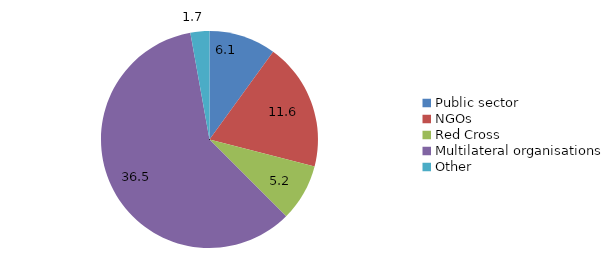
| Category | DAC donors |
|---|---|
| Public sector | 6.102 |
| NGOs  | 11.637 |
| Red Cross | 5.204 |
| Multilateral organisations | 36.48 |
| Other | 1.73 |